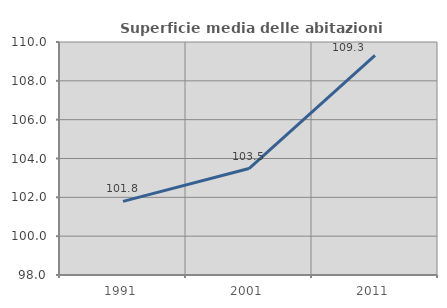
| Category | Superficie media delle abitazioni occupate |
|---|---|
| 1991.0 | 101.79 |
| 2001.0 | 103.484 |
| 2011.0 | 109.307 |